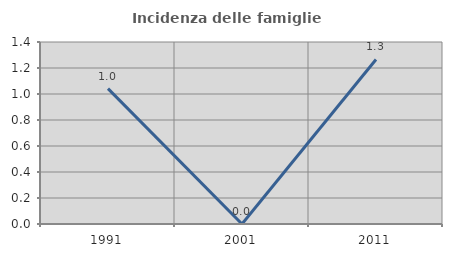
| Category | Incidenza delle famiglie numerose |
|---|---|
| 1991.0 | 1.042 |
| 2001.0 | 0 |
| 2011.0 | 1.266 |